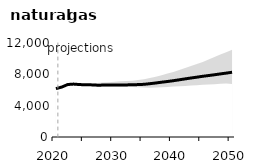
| Category | Ref |
|---|---|
| 2020.0 | 6173.746 |
| 2021.0 | 6377.672 |
| 2022.0 | 6699.253 |
| 2023.0 | 6754.571 |
| 2024.0 | 6695.875 |
| 2025.0 | 6664.031 |
| 2026.0 | 6655.892 |
| 2027.0 | 6618.795 |
| 2028.0 | 6623.637 |
| 2029.0 | 6635.914 |
| 2030.0 | 6637.893 |
| 2031.0 | 6637.293 |
| 2032.0 | 6649.144 |
| 2033.0 | 6669.532 |
| 2034.0 | 6690.197 |
| 2035.0 | 6726.225 |
| 2036.0 | 6805.688 |
| 2037.0 | 6894.716 |
| 2038.0 | 6995.689 |
| 2039.0 | 7086.023 |
| 2040.0 | 7187.31 |
| 2041.0 | 7300.724 |
| 2042.0 | 7418.55 |
| 2043.0 | 7531.72 |
| 2044.0 | 7637.416 |
| 2045.0 | 7750.386 |
| 2046.0 | 7844.701 |
| 2047.0 | 7945.288 |
| 2048.0 | 8054.087 |
| 2049.0 | 8155.849 |
| 2050.0 | 8265.959 |